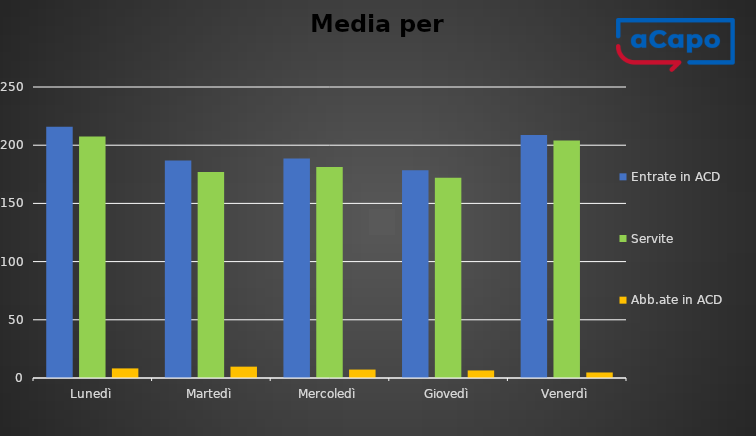
| Category | Entrate in ACD | Servite | Abb.ate in ACD |
|---|---|---|---|
| Lunedì | 215.75 | 207.5 | 8.25 |
| Martedì | 186.75 | 177 | 9.75 |
| Mercoledì | 188.5 | 181.25 | 7.25 |
| Giovedì | 178.5 | 172 | 6.5 |
| Venerdì | 208.75 | 204 | 4.75 |